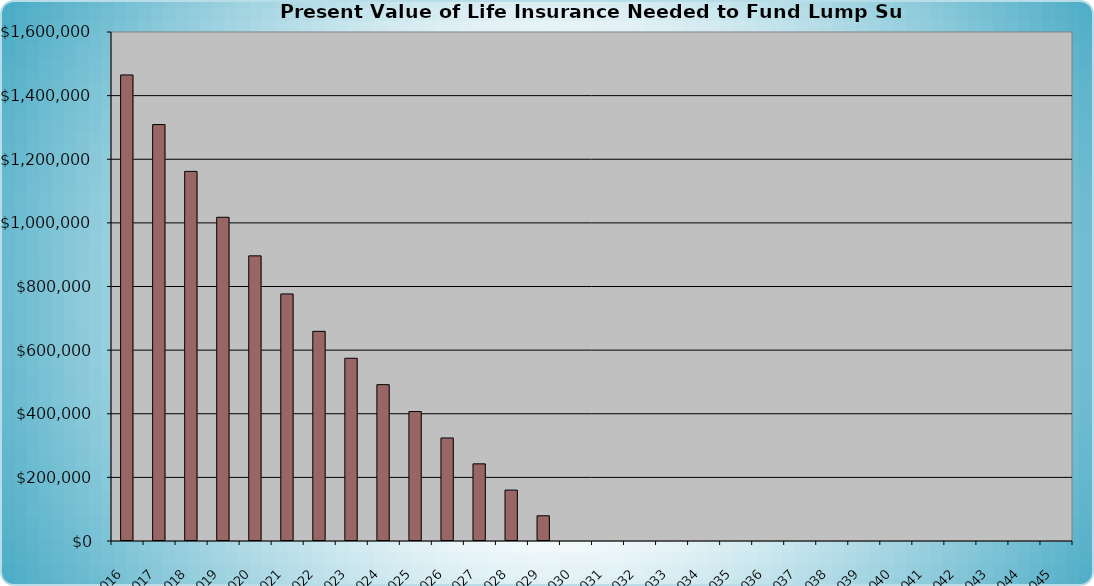
| Category | Present Value of Life Insurance Needed to Fund Income Replacement |
|---|---|
| 2016.0 | 1464993.254 |
| 2017.0 | 1308993.254 |
| 2018.0 | 1161877.869 |
| 2019.0 | 1017591.627 |
| 2020.0 | 896315.455 |
| 2021.0 | 776545.145 |
| 2022.0 | 659078.111 |
| 2023.0 | 574457.754 |
| 2024.0 | 491464.711 |
| 2025.0 | 406838.599 |
| 2026.0 | 323839.913 |
| 2027.0 | 242437.355 |
| 2028.0 | 160050.701 |
| 2029.0 | 79248.405 |
| 2030.0 | 0 |
| 2031.0 | 0 |
| 2032.0 | 0 |
| 2033.0 | 0 |
| 2034.0 | 0 |
| 2035.0 | 0 |
| 2036.0 | 0 |
| 2037.0 | 0 |
| 2038.0 | 0 |
| 2039.0 | 0 |
| 2040.0 | 0 |
| 2041.0 | 0 |
| 2042.0 | 0 |
| 2043.0 | 0 |
| 2044.0 | 0 |
| 2045.0 | 0 |